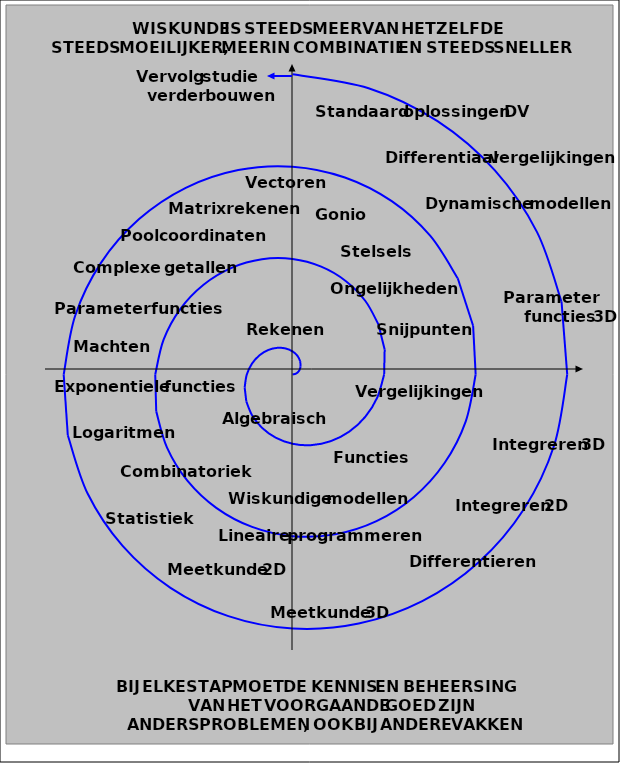
| Category | Series 0 |
|---|---|
| 0.0 | 0 |
| 0.040246909428711175 | 0.011 |
| 0.07216878364870322 | 0.042 |
| 0.08838834764831845 | 0.088 |
| 0.08333333333333334 | 0.144 |
| 0.05392063439635849 | 0.201 |
| 1.531435568635775e-17 | 0.25 |
| -0.07548888815490191 | 0.282 |
| -0.16666666666666657 | 0.289 |
| -0.2651650429449553 | 0.265 |
| -0.36084391824351614 | 0.208 |
| -0.4427160037158229 | 0.119 |
| -0.5 | 0 |
| -0.5232098225732453 | -0.14 |
| -0.5051814855409226 | -0.292 |
| -0.44194173824159233 | -0.442 |
| -0.3333333333333336 | -0.577 |
| -0.18333015694761878 | -0.684 |
| -1.3782920117721975e-16 | -0.75 |
| 0.20489841070616255 | -0.765 |
| 0.4166666666666668 | -0.722 |
| 0.618718433538229 | -0.619 |
| 0.7938566201357351 | -0.458 |
| 0.9256789168603572 | -0.248 |
| 1.0 | 0 |
| 1.0061727357177797 | 0.27 |
| 0.9381941874331422 | 0.542 |
| 0.7954951288348668 | 0.795 |
| 0.583333333333333 | 1.01 |
| 0.3127396794988792 | 1.167 |
| 3.8285889215894375e-16 | 1.25 |
| -0.3343079332574219 | 1.248 |
| -0.6666666666666656 | 1.155 |
| -0.9722718241315034 | 0.972 |
| -1.226869322027955 | 0.708 |
| -1.4086418300048913 | 0.377 |
| -1.5 | 0 |
| -1.4891356488623133 | -0.399 |
| -1.3712068893253606 | -0.792 |
| -1.149048519428139 | -1.149 |
| -0.833333333333333 | -1.443 |
| -0.44214920205013986 | -1.65 |
| -7.504034286315298e-16 | -1.75 |
| 0.46371745580868184 | -1.731 |
| 0.916666666666665 | -1.588 |
| 1.325825214724777 | -1.326 |
| 1.6598820239201741 | -0.958 |
| 1.8916047431494252 | -0.507 |
| 2.0 | 0 |
| 1.972098562006848 | 0.528 |
| 1.8042195912175818 | 1.042 |
| 1.5026019100214156 | 1.503 |
| 1.0833333333333364 | 1.876 |
| 0.5715587246014044 | 2.133 |
| 5.237265699245541e-15 | 2.25 |
| -0.5931269783599453 | 2.214 |
| -1.166666666666668 | 2.021 |
| -1.679378605318051 | 1.679 |
| -2.092894725812393 | 1.208 |
| -2.3745676562939595 | 0.636 |
| -2.5 | 0 |
| -2.4550614751513824 | -0.658 |
| -2.2372322931098014 | -1.292 |
| -1.8561553006146936 | -1.856 |
| -1.3333333333333375 | -2.309 |
| -0.7009682471526614 | -2.616 |
| 3.031944270301401e-15 | -2.75 |
| 0.722536500911201 | -2.697 |
| 1.416666666666668 | -2.454 |
| 2.0329319959113206 | -2.033 |
| 2.5259074277046123 | -1.458 |
| 2.857530569438492 | -0.766 |
| 3.0 | 0 |
| 2.938024388295918 | 0.787 |
| 2.670244995002016 | 1.542 |
| 2.2097086912079607 | 2.21 |
| 1.5833333333333288 | 2.742 |
| 0.8303777697039223 | 3.099 |
| -3.1850336170563542e-15 | 3.25 |